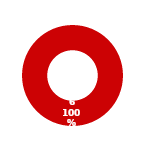
| Category | TVM |
|---|---|
| MIL 1 Complete | 0 |
| MIL 1 Not Complete | 6 |